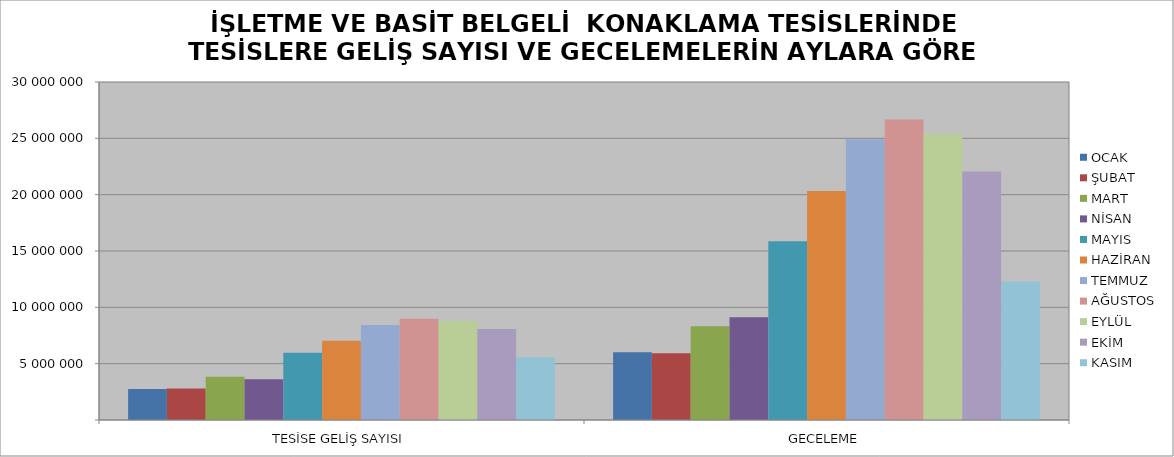
| Category | OCAK | ŞUBAT | MART | NİSAN | MAYIS | HAZİRAN | TEMMUZ | AĞUSTOS | EYLÜL | EKİM | KASIM |
|---|---|---|---|---|---|---|---|---|---|---|---|
| TESİSE GELİŞ SAYISI | 2752012 | 2800059 | 3828458 | 3612924 | 5975439 | 7040520 | 8433434 | 8994064 | 8797368 | 8067354 | 5562469 |
| GECELEME | 6020345 | 5929648 | 8312048 | 9130051 | 15857894 | 20320271 | 24913644 | 26662869 | 25388839 | 22061347 | 12301645 |